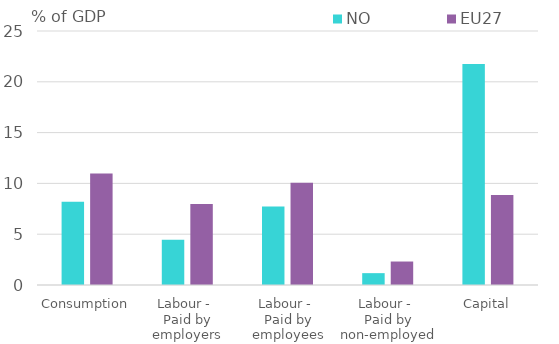
| Category | NO | EU27 |
|---|---|---|
| Consumption | 8.182 | 10.967 |
| Labour - 
Paid by employers | 4.452 | 7.966 |
| Labour - 
Paid by employees | 7.717 | 10.052 |
| Labour - 
Paid by non-employed | 1.167 | 2.311 |
| Capital | 21.76 | 8.858 |